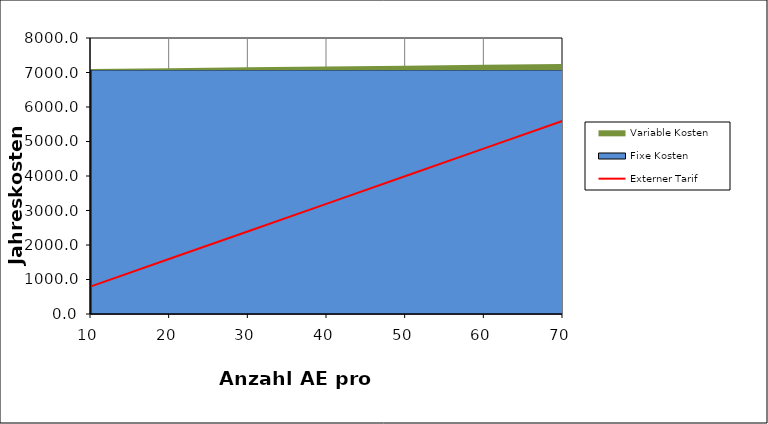
| Category | Externer Tarif |
|---|---|
| 10.0 | 800 |
| 20.0 | 1600 |
| 30.0 | 2400 |
| 40.0 | 3200 |
| 50.0 | 4000 |
| 60.0 | 4800 |
| 70.0 | 5600 |